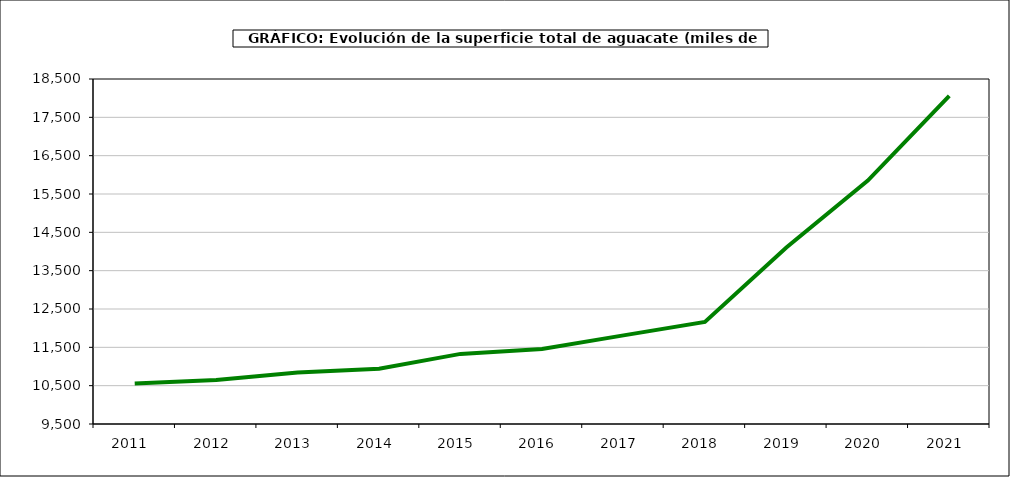
| Category | superficie aguacate |
|---|---|
| 2011.0 | 10558 |
| 2012.0 | 10645 |
| 2013.0 | 10845 |
| 2014.0 | 10943 |
| 2015.0 | 11329 |
| 2016.0 | 11455 |
| 2017.0 | 11812 |
| 2018.0 | 12161 |
| 2019.0 | 14104 |
| 2020.0 | 15849 |
| 2021.0 | 18061 |